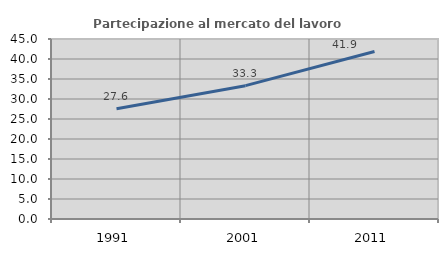
| Category | Partecipazione al mercato del lavoro  femminile |
|---|---|
| 1991.0 | 27.559 |
| 2001.0 | 33.333 |
| 2011.0 | 41.86 |